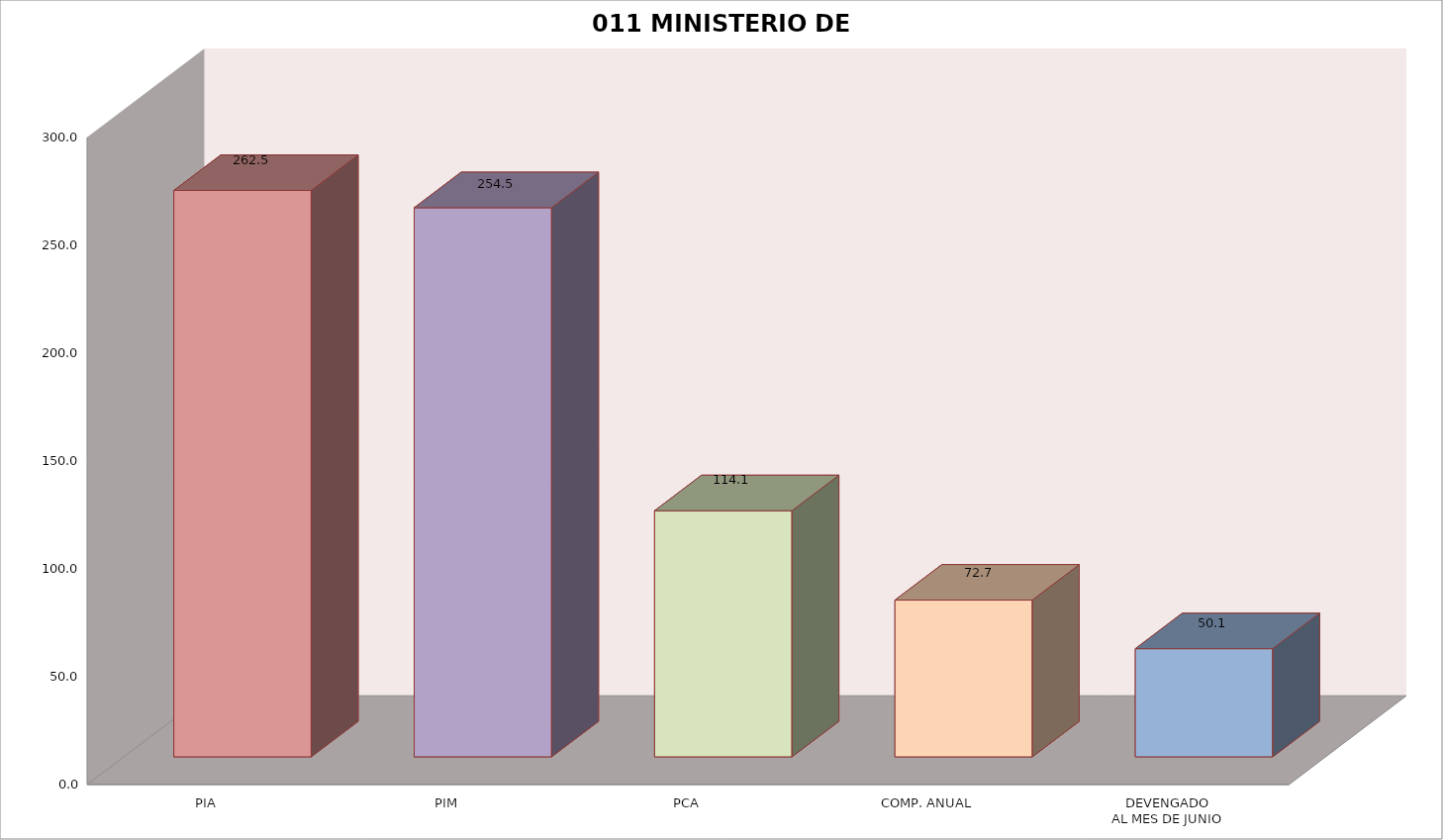
| Category | 011 MINISTERIO DE SALUD |
|---|---|
| PIA | 262.508 |
| PIM | 254.515 |
| PCA | 114.079 |
| COMP. ANUAL | 72.654 |
| DEVENGADO
AL MES DE JUNIO | 50.119 |